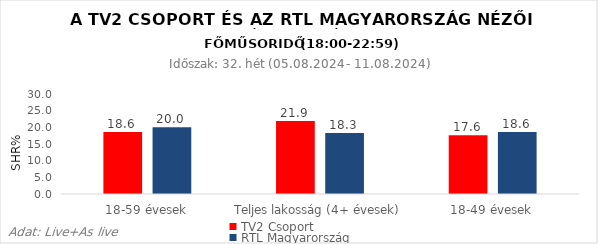
| Category | TV2 Csoport | RTL Magyarország |
|---|---|---|
| 18-59 évesek | 18.6 | 20 |
| Teljes lakosság (4+ évesek) | 21.9 | 18.3 |
| 18-49 évesek | 17.6 | 18.6 |